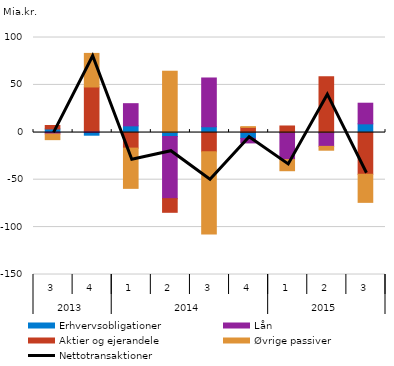
| Category | Erhvervsobligationer | Lån | Aktier og ejerandele | Øvrige passiver |
|---|---|---|---|---|
| 0 | 3.521 | -1.739 | 3.65 | -6.011 |
| 1 | -3.059 | 1.329 | 46.486 | 35.407 |
| 2 | 6.825 | 23.368 | -16.69 | -42.443 |
| 3 | -4.448 | -65.557 | -14.388 | 64.422 |
| 4 | 5.847 | 51.448 | -20.58 | -86.679 |
| 5 | -6.439 | -4.76 | 5.107 | 0.854 |
| 6 | -0.909 | -27.867 | 6.665 | -11.754 |
| 7 | -0.96 | -13.886 | 58.554 | -4.042 |
| 8 | 8.936 | 21.75 | -44.273 | -29.625 |